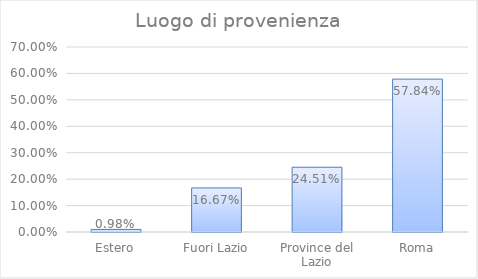
| Category | Series 0 |
|---|---|
| Estero | 0.01 |
| Fuori Lazio | 0.167 |
| Province del Lazio | 0.245 |
| Roma | 0.578 |